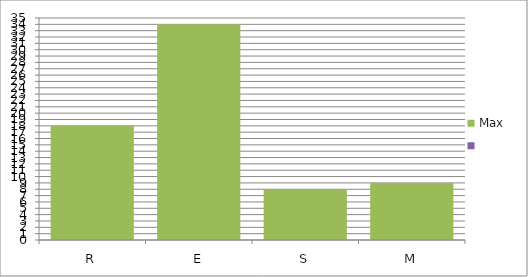
| Category | Max | Series 3 |
|---|---|---|
| R | 18 | 0 |
| E | 34 | 0 |
| S | 8 | 0 |
| M | 9 | 0 |